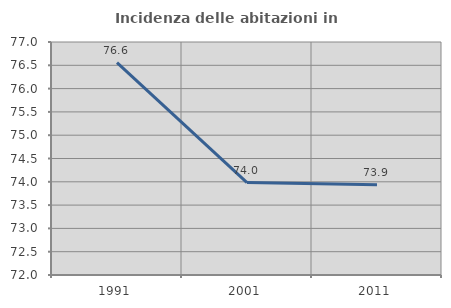
| Category | Incidenza delle abitazioni in proprietà  |
|---|---|
| 1991.0 | 76.557 |
| 2001.0 | 73.984 |
| 2011.0 | 73.937 |